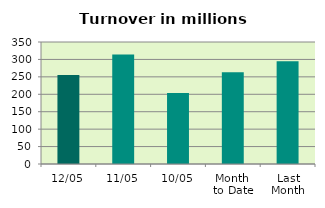
| Category | Series 0 |
|---|---|
| 12/05 | 255.449 |
| 11/05 | 314.433 |
| 10/05 | 203.735 |
| Month 
to Date | 263.376 |
| Last
Month | 294.539 |